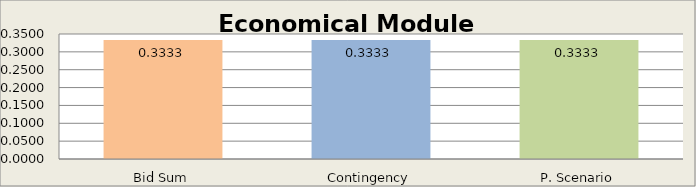
| Category | Economical Module |
|---|---|
| Bid Sum | 0.333 |
| Contingency | 0.333 |
| P. Scenario | 0.333 |